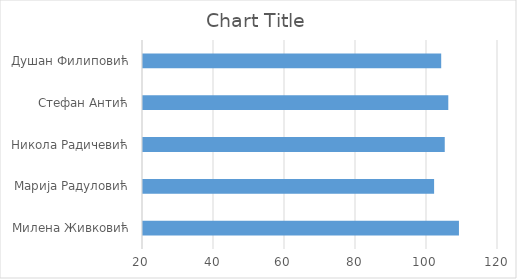
| Category | Series 0 |
|---|---|
| Милена Живковић | 109 |
| Марија Радуловић | 102 |
| Никола Радичевић | 105 |
| Стефан Антић | 106 |
| Душан Филиповић | 104 |